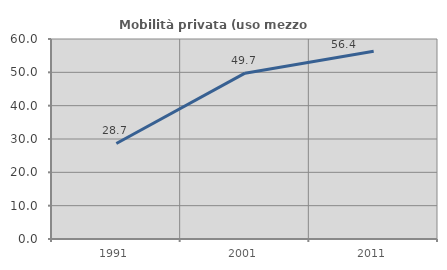
| Category | Mobilità privata (uso mezzo privato) |
|---|---|
| 1991.0 | 28.653 |
| 2001.0 | 49.747 |
| 2011.0 | 56.355 |